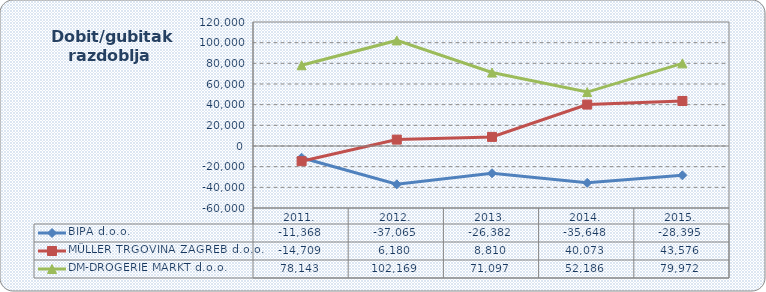
| Category | BIPA d.o.o. | MÜLLER TRGOVINA ZAGREB d.o.o. | DM-DROGERIE MARKT d.o.o. |
|---|---|---|---|
| 2011. | -11367.749 | -14709.061 | 78143.087 |
| 2012. | -37064.602 | 6179.63 | 102168.854 |
| 2013. | -26382.342 | 8809.987 | 71097.215 |
| 2014. | -35647.783 | 40073.161 | 52185.623 |
| 2015. | -28395.048 | 43576.218 | 79971.832 |